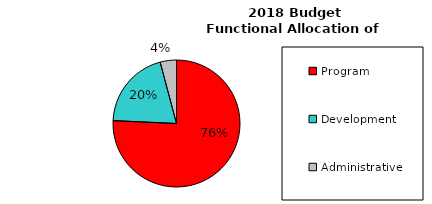
| Category | Functional Allocation of Expenses |
|---|---|
| Program | 3184228.99 |
| Development | 846303.174 |
| Administrative | 174444.645 |